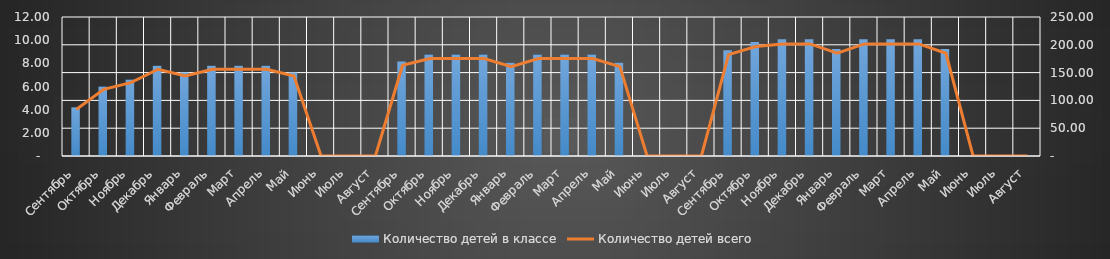
| Category | Количество детей в классе |
|---|---|
| Сентябрь | 4.2 |
| Октябрь | 6 |
| Ноябрь | 6.6 |
| Декабрь | 7.8 |
| Январь | 7.2 |
| Февраль | 7.8 |
| Март | 7.8 |
| Апрель | 7.8 |
| Май | 7.2 |
| Июнь | 0 |
| Июль | 0 |
| Август | 0 |
| Сентябрь | 8.16 |
| Октябрь | 8.76 |
| Ноябрь | 8.76 |
| Декабрь | 8.76 |
| Январь | 8.04 |
| Февраль | 8.76 |
| Март | 8.76 |
| Апрель | 8.76 |
| Май | 8.04 |
| Июнь | 0 |
| Июль | 0 |
| Август | 0 |
| Сентябрь | 9.12 |
| Октябрь | 9.84 |
| Ноябрь | 10.08 |
| Декабрь | 10.08 |
| Январь | 9.24 |
| Февраль | 10.08 |
| Март | 10.08 |
| Апрель | 10.08 |
| Май | 9.24 |
| Июнь | 0 |
| Июль | 0 |
| Август | 0 |